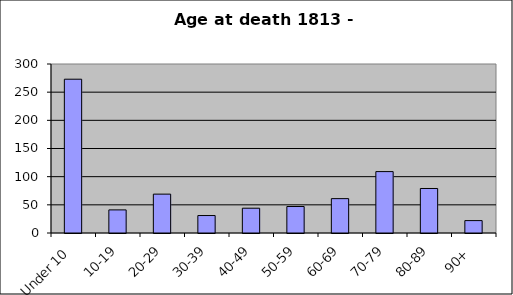
| Category | Series 0 |
|---|---|
| Under 10 | 273 |
| 10-19 | 41 |
| 20-29 | 69 |
| 30-39 | 31 |
| 40-49 | 44 |
| 50-59 | 47 |
| 60-69 | 61 |
| 70-79 | 109 |
| 80-89 | 79 |
| 90+ | 22 |